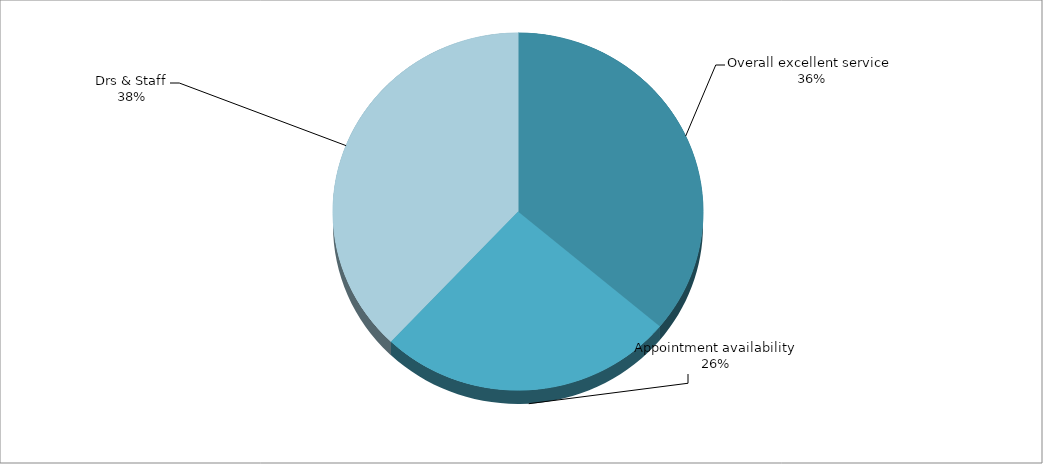
| Category | Series 0 |
|---|---|
| Overall excellent service  | 39 |
| Appointment availability | 28 |
| Drs & Staff | 41 |